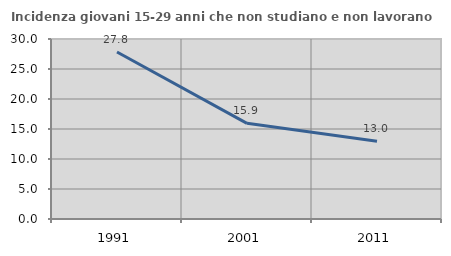
| Category | Incidenza giovani 15-29 anni che non studiano e non lavorano  |
|---|---|
| 1991.0 | 27.835 |
| 2001.0 | 15.945 |
| 2011.0 | 12.963 |